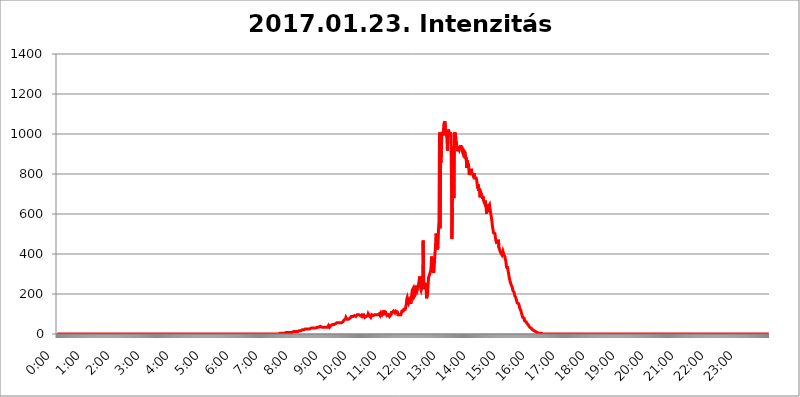
| Category | 2017.01.23. Intenzitás [W/m^2] |
|---|---|
| 0.0 | 0 |
| 0.0006944444444444445 | 0 |
| 0.001388888888888889 | 0 |
| 0.0020833333333333333 | 0 |
| 0.002777777777777778 | 0 |
| 0.003472222222222222 | 0 |
| 0.004166666666666667 | 0 |
| 0.004861111111111111 | 0 |
| 0.005555555555555556 | 0 |
| 0.0062499999999999995 | 0 |
| 0.006944444444444444 | 0 |
| 0.007638888888888889 | 0 |
| 0.008333333333333333 | 0 |
| 0.009027777777777779 | 0 |
| 0.009722222222222222 | 0 |
| 0.010416666666666666 | 0 |
| 0.011111111111111112 | 0 |
| 0.011805555555555555 | 0 |
| 0.012499999999999999 | 0 |
| 0.013194444444444444 | 0 |
| 0.013888888888888888 | 0 |
| 0.014583333333333332 | 0 |
| 0.015277777777777777 | 0 |
| 0.015972222222222224 | 0 |
| 0.016666666666666666 | 0 |
| 0.017361111111111112 | 0 |
| 0.018055555555555557 | 0 |
| 0.01875 | 0 |
| 0.019444444444444445 | 0 |
| 0.02013888888888889 | 0 |
| 0.020833333333333332 | 0 |
| 0.02152777777777778 | 0 |
| 0.022222222222222223 | 0 |
| 0.02291666666666667 | 0 |
| 0.02361111111111111 | 0 |
| 0.024305555555555556 | 0 |
| 0.024999999999999998 | 0 |
| 0.025694444444444447 | 0 |
| 0.02638888888888889 | 0 |
| 0.027083333333333334 | 0 |
| 0.027777777777777776 | 0 |
| 0.02847222222222222 | 0 |
| 0.029166666666666664 | 0 |
| 0.029861111111111113 | 0 |
| 0.030555555555555555 | 0 |
| 0.03125 | 0 |
| 0.03194444444444445 | 0 |
| 0.03263888888888889 | 0 |
| 0.03333333333333333 | 0 |
| 0.034027777777777775 | 0 |
| 0.034722222222222224 | 0 |
| 0.035416666666666666 | 0 |
| 0.036111111111111115 | 0 |
| 0.03680555555555556 | 0 |
| 0.0375 | 0 |
| 0.03819444444444444 | 0 |
| 0.03888888888888889 | 0 |
| 0.03958333333333333 | 0 |
| 0.04027777777777778 | 0 |
| 0.04097222222222222 | 0 |
| 0.041666666666666664 | 0 |
| 0.042361111111111106 | 0 |
| 0.04305555555555556 | 0 |
| 0.043750000000000004 | 0 |
| 0.044444444444444446 | 0 |
| 0.04513888888888889 | 0 |
| 0.04583333333333334 | 0 |
| 0.04652777777777778 | 0 |
| 0.04722222222222222 | 0 |
| 0.04791666666666666 | 0 |
| 0.04861111111111111 | 0 |
| 0.049305555555555554 | 0 |
| 0.049999999999999996 | 0 |
| 0.05069444444444445 | 0 |
| 0.051388888888888894 | 0 |
| 0.052083333333333336 | 0 |
| 0.05277777777777778 | 0 |
| 0.05347222222222222 | 0 |
| 0.05416666666666667 | 0 |
| 0.05486111111111111 | 0 |
| 0.05555555555555555 | 0 |
| 0.05625 | 0 |
| 0.05694444444444444 | 0 |
| 0.057638888888888885 | 0 |
| 0.05833333333333333 | 0 |
| 0.05902777777777778 | 0 |
| 0.059722222222222225 | 0 |
| 0.06041666666666667 | 0 |
| 0.061111111111111116 | 0 |
| 0.06180555555555556 | 0 |
| 0.0625 | 0 |
| 0.06319444444444444 | 0 |
| 0.06388888888888888 | 0 |
| 0.06458333333333334 | 0 |
| 0.06527777777777778 | 0 |
| 0.06597222222222222 | 0 |
| 0.06666666666666667 | 0 |
| 0.06736111111111111 | 0 |
| 0.06805555555555555 | 0 |
| 0.06874999999999999 | 0 |
| 0.06944444444444443 | 0 |
| 0.07013888888888889 | 0 |
| 0.07083333333333333 | 0 |
| 0.07152777777777779 | 0 |
| 0.07222222222222223 | 0 |
| 0.07291666666666667 | 0 |
| 0.07361111111111111 | 0 |
| 0.07430555555555556 | 0 |
| 0.075 | 0 |
| 0.07569444444444444 | 0 |
| 0.0763888888888889 | 0 |
| 0.07708333333333334 | 0 |
| 0.07777777777777778 | 0 |
| 0.07847222222222222 | 0 |
| 0.07916666666666666 | 0 |
| 0.0798611111111111 | 0 |
| 0.08055555555555556 | 0 |
| 0.08125 | 0 |
| 0.08194444444444444 | 0 |
| 0.08263888888888889 | 0 |
| 0.08333333333333333 | 0 |
| 0.08402777777777777 | 0 |
| 0.08472222222222221 | 0 |
| 0.08541666666666665 | 0 |
| 0.08611111111111112 | 0 |
| 0.08680555555555557 | 0 |
| 0.08750000000000001 | 0 |
| 0.08819444444444445 | 0 |
| 0.08888888888888889 | 0 |
| 0.08958333333333333 | 0 |
| 0.09027777777777778 | 0 |
| 0.09097222222222222 | 0 |
| 0.09166666666666667 | 0 |
| 0.09236111111111112 | 0 |
| 0.09305555555555556 | 0 |
| 0.09375 | 0 |
| 0.09444444444444444 | 0 |
| 0.09513888888888888 | 0 |
| 0.09583333333333333 | 0 |
| 0.09652777777777777 | 0 |
| 0.09722222222222222 | 0 |
| 0.09791666666666667 | 0 |
| 0.09861111111111111 | 0 |
| 0.09930555555555555 | 0 |
| 0.09999999999999999 | 0 |
| 0.10069444444444443 | 0 |
| 0.1013888888888889 | 0 |
| 0.10208333333333335 | 0 |
| 0.10277777777777779 | 0 |
| 0.10347222222222223 | 0 |
| 0.10416666666666667 | 0 |
| 0.10486111111111111 | 0 |
| 0.10555555555555556 | 0 |
| 0.10625 | 0 |
| 0.10694444444444444 | 0 |
| 0.1076388888888889 | 0 |
| 0.10833333333333334 | 0 |
| 0.10902777777777778 | 0 |
| 0.10972222222222222 | 0 |
| 0.1111111111111111 | 0 |
| 0.11180555555555556 | 0 |
| 0.11180555555555556 | 0 |
| 0.1125 | 0 |
| 0.11319444444444444 | 0 |
| 0.11388888888888889 | 0 |
| 0.11458333333333333 | 0 |
| 0.11527777777777777 | 0 |
| 0.11597222222222221 | 0 |
| 0.11666666666666665 | 0 |
| 0.1173611111111111 | 0 |
| 0.11805555555555557 | 0 |
| 0.11944444444444445 | 0 |
| 0.12013888888888889 | 0 |
| 0.12083333333333333 | 0 |
| 0.12152777777777778 | 0 |
| 0.12222222222222223 | 0 |
| 0.12291666666666667 | 0 |
| 0.12291666666666667 | 0 |
| 0.12361111111111112 | 0 |
| 0.12430555555555556 | 0 |
| 0.125 | 0 |
| 0.12569444444444444 | 0 |
| 0.12638888888888888 | 0 |
| 0.12708333333333333 | 0 |
| 0.16875 | 0 |
| 0.12847222222222224 | 0 |
| 0.12916666666666668 | 0 |
| 0.12986111111111112 | 0 |
| 0.13055555555555556 | 0 |
| 0.13125 | 0 |
| 0.13194444444444445 | 0 |
| 0.1326388888888889 | 0 |
| 0.13333333333333333 | 0 |
| 0.13402777777777777 | 0 |
| 0.13402777777777777 | 0 |
| 0.13472222222222222 | 0 |
| 0.13541666666666666 | 0 |
| 0.1361111111111111 | 0 |
| 0.13749999999999998 | 0 |
| 0.13819444444444443 | 0 |
| 0.1388888888888889 | 0 |
| 0.13958333333333334 | 0 |
| 0.14027777777777778 | 0 |
| 0.14097222222222222 | 0 |
| 0.14166666666666666 | 0 |
| 0.1423611111111111 | 0 |
| 0.14305555555555557 | 0 |
| 0.14375000000000002 | 0 |
| 0.14444444444444446 | 0 |
| 0.1451388888888889 | 0 |
| 0.1451388888888889 | 0 |
| 0.14652777777777778 | 0 |
| 0.14722222222222223 | 0 |
| 0.14791666666666667 | 0 |
| 0.1486111111111111 | 0 |
| 0.14930555555555555 | 0 |
| 0.15 | 0 |
| 0.15069444444444444 | 0 |
| 0.15138888888888888 | 0 |
| 0.15208333333333332 | 0 |
| 0.15277777777777776 | 0 |
| 0.15347222222222223 | 0 |
| 0.15416666666666667 | 0 |
| 0.15486111111111112 | 0 |
| 0.15555555555555556 | 0 |
| 0.15625 | 0 |
| 0.15694444444444444 | 0 |
| 0.15763888888888888 | 0 |
| 0.15833333333333333 | 0 |
| 0.15902777777777777 | 0 |
| 0.15972222222222224 | 0 |
| 0.16041666666666668 | 0 |
| 0.16111111111111112 | 0 |
| 0.16180555555555556 | 0 |
| 0.1625 | 0 |
| 0.16319444444444445 | 0 |
| 0.1638888888888889 | 0 |
| 0.16458333333333333 | 0 |
| 0.16527777777777777 | 0 |
| 0.16597222222222222 | 0 |
| 0.16666666666666666 | 0 |
| 0.1673611111111111 | 0 |
| 0.16805555555555554 | 0 |
| 0.16874999999999998 | 0 |
| 0.16944444444444443 | 0 |
| 0.17013888888888887 | 0 |
| 0.1708333333333333 | 0 |
| 0.17152777777777775 | 0 |
| 0.17222222222222225 | 0 |
| 0.1729166666666667 | 0 |
| 0.17361111111111113 | 0 |
| 0.17430555555555557 | 0 |
| 0.17500000000000002 | 0 |
| 0.17569444444444446 | 0 |
| 0.1763888888888889 | 0 |
| 0.17708333333333334 | 0 |
| 0.17777777777777778 | 0 |
| 0.17847222222222223 | 0 |
| 0.17916666666666667 | 0 |
| 0.1798611111111111 | 0 |
| 0.18055555555555555 | 0 |
| 0.18125 | 0 |
| 0.18194444444444444 | 0 |
| 0.1826388888888889 | 0 |
| 0.18333333333333335 | 0 |
| 0.1840277777777778 | 0 |
| 0.18472222222222223 | 0 |
| 0.18541666666666667 | 0 |
| 0.18611111111111112 | 0 |
| 0.18680555555555556 | 0 |
| 0.1875 | 0 |
| 0.18819444444444444 | 0 |
| 0.18888888888888888 | 0 |
| 0.18958333333333333 | 0 |
| 0.19027777777777777 | 0 |
| 0.1909722222222222 | 0 |
| 0.19166666666666665 | 0 |
| 0.19236111111111112 | 0 |
| 0.19305555555555554 | 0 |
| 0.19375 | 0 |
| 0.19444444444444445 | 0 |
| 0.1951388888888889 | 0 |
| 0.19583333333333333 | 0 |
| 0.19652777777777777 | 0 |
| 0.19722222222222222 | 0 |
| 0.19791666666666666 | 0 |
| 0.1986111111111111 | 0 |
| 0.19930555555555554 | 0 |
| 0.19999999999999998 | 0 |
| 0.20069444444444443 | 0 |
| 0.20138888888888887 | 0 |
| 0.2020833333333333 | 0 |
| 0.2027777777777778 | 0 |
| 0.2034722222222222 | 0 |
| 0.2041666666666667 | 0 |
| 0.20486111111111113 | 0 |
| 0.20555555555555557 | 0 |
| 0.20625000000000002 | 0 |
| 0.20694444444444446 | 0 |
| 0.2076388888888889 | 0 |
| 0.20833333333333334 | 0 |
| 0.20902777777777778 | 0 |
| 0.20972222222222223 | 0 |
| 0.21041666666666667 | 0 |
| 0.2111111111111111 | 0 |
| 0.21180555555555555 | 0 |
| 0.2125 | 0 |
| 0.21319444444444444 | 0 |
| 0.2138888888888889 | 0 |
| 0.21458333333333335 | 0 |
| 0.2152777777777778 | 0 |
| 0.21597222222222223 | 0 |
| 0.21666666666666667 | 0 |
| 0.21736111111111112 | 0 |
| 0.21805555555555556 | 0 |
| 0.21875 | 0 |
| 0.21944444444444444 | 0 |
| 0.22013888888888888 | 0 |
| 0.22083333333333333 | 0 |
| 0.22152777777777777 | 0 |
| 0.2222222222222222 | 0 |
| 0.22291666666666665 | 0 |
| 0.2236111111111111 | 0 |
| 0.22430555555555556 | 0 |
| 0.225 | 0 |
| 0.22569444444444445 | 0 |
| 0.2263888888888889 | 0 |
| 0.22708333333333333 | 0 |
| 0.22777777777777777 | 0 |
| 0.22847222222222222 | 0 |
| 0.22916666666666666 | 0 |
| 0.2298611111111111 | 0 |
| 0.23055555555555554 | 0 |
| 0.23124999999999998 | 0 |
| 0.23194444444444443 | 0 |
| 0.23263888888888887 | 0 |
| 0.2333333333333333 | 0 |
| 0.2340277777777778 | 0 |
| 0.2347222222222222 | 0 |
| 0.2354166666666667 | 0 |
| 0.23611111111111113 | 0 |
| 0.23680555555555557 | 0 |
| 0.23750000000000002 | 0 |
| 0.23819444444444446 | 0 |
| 0.2388888888888889 | 0 |
| 0.23958333333333334 | 0 |
| 0.24027777777777778 | 0 |
| 0.24097222222222223 | 0 |
| 0.24166666666666667 | 0 |
| 0.2423611111111111 | 0 |
| 0.24305555555555555 | 0 |
| 0.24375 | 0 |
| 0.24444444444444446 | 0 |
| 0.24513888888888888 | 0 |
| 0.24583333333333335 | 0 |
| 0.2465277777777778 | 0 |
| 0.24722222222222223 | 0 |
| 0.24791666666666667 | 0 |
| 0.24861111111111112 | 0 |
| 0.24930555555555556 | 0 |
| 0.25 | 0 |
| 0.25069444444444444 | 0 |
| 0.2513888888888889 | 0 |
| 0.2520833333333333 | 0 |
| 0.25277777777777777 | 0 |
| 0.2534722222222222 | 0 |
| 0.25416666666666665 | 0 |
| 0.2548611111111111 | 0 |
| 0.2555555555555556 | 0 |
| 0.25625000000000003 | 0 |
| 0.2569444444444445 | 0 |
| 0.2576388888888889 | 0 |
| 0.25833333333333336 | 0 |
| 0.2590277777777778 | 0 |
| 0.25972222222222224 | 0 |
| 0.2604166666666667 | 0 |
| 0.2611111111111111 | 0 |
| 0.26180555555555557 | 0 |
| 0.2625 | 0 |
| 0.26319444444444445 | 0 |
| 0.2638888888888889 | 0 |
| 0.26458333333333334 | 0 |
| 0.2652777777777778 | 0 |
| 0.2659722222222222 | 0 |
| 0.26666666666666666 | 0 |
| 0.2673611111111111 | 0 |
| 0.26805555555555555 | 0 |
| 0.26875 | 0 |
| 0.26944444444444443 | 0 |
| 0.2701388888888889 | 0 |
| 0.2708333333333333 | 0 |
| 0.27152777777777776 | 0 |
| 0.2722222222222222 | 0 |
| 0.27291666666666664 | 0 |
| 0.2736111111111111 | 0 |
| 0.2743055555555555 | 0 |
| 0.27499999999999997 | 0 |
| 0.27569444444444446 | 0 |
| 0.27638888888888885 | 0 |
| 0.27708333333333335 | 0 |
| 0.2777777777777778 | 0 |
| 0.27847222222222223 | 0 |
| 0.2791666666666667 | 0 |
| 0.2798611111111111 | 0 |
| 0.28055555555555556 | 0 |
| 0.28125 | 0 |
| 0.28194444444444444 | 0 |
| 0.2826388888888889 | 0 |
| 0.2833333333333333 | 0 |
| 0.28402777777777777 | 0 |
| 0.2847222222222222 | 0 |
| 0.28541666666666665 | 0 |
| 0.28611111111111115 | 0 |
| 0.28680555555555554 | 0 |
| 0.28750000000000003 | 0 |
| 0.2881944444444445 | 0 |
| 0.2888888888888889 | 0 |
| 0.28958333333333336 | 0 |
| 0.2902777777777778 | 0 |
| 0.29097222222222224 | 0 |
| 0.2916666666666667 | 0 |
| 0.2923611111111111 | 0 |
| 0.29305555555555557 | 0 |
| 0.29375 | 0 |
| 0.29444444444444445 | 0 |
| 0.2951388888888889 | 0 |
| 0.29583333333333334 | 0 |
| 0.2965277777777778 | 0 |
| 0.2972222222222222 | 0 |
| 0.29791666666666666 | 0 |
| 0.2986111111111111 | 0 |
| 0.29930555555555555 | 0 |
| 0.3 | 0 |
| 0.30069444444444443 | 0 |
| 0.3013888888888889 | 0 |
| 0.3020833333333333 | 0 |
| 0.30277777777777776 | 0 |
| 0.3034722222222222 | 0 |
| 0.30416666666666664 | 0 |
| 0.3048611111111111 | 0 |
| 0.3055555555555555 | 0 |
| 0.30624999999999997 | 0 |
| 0.3069444444444444 | 0 |
| 0.3076388888888889 | 0 |
| 0.30833333333333335 | 0 |
| 0.3090277777777778 | 0 |
| 0.30972222222222223 | 0 |
| 0.3104166666666667 | 0 |
| 0.3111111111111111 | 0 |
| 0.31180555555555556 | 0 |
| 0.3125 | 3.525 |
| 0.31319444444444444 | 3.525 |
| 0.3138888888888889 | 3.525 |
| 0.3145833333333333 | 3.525 |
| 0.31527777777777777 | 3.525 |
| 0.3159722222222222 | 3.525 |
| 0.31666666666666665 | 3.525 |
| 0.31736111111111115 | 3.525 |
| 0.31805555555555554 | 3.525 |
| 0.31875000000000003 | 3.525 |
| 0.3194444444444445 | 7.887 |
| 0.3201388888888889 | 3.525 |
| 0.32083333333333336 | 7.887 |
| 0.3215277777777778 | 7.887 |
| 0.32222222222222224 | 7.887 |
| 0.3229166666666667 | 7.887 |
| 0.3236111111111111 | 7.887 |
| 0.32430555555555557 | 7.887 |
| 0.325 | 7.887 |
| 0.32569444444444445 | 7.887 |
| 0.3263888888888889 | 7.887 |
| 0.32708333333333334 | 7.887 |
| 0.3277777777777778 | 7.887 |
| 0.3284722222222222 | 7.887 |
| 0.32916666666666666 | 7.887 |
| 0.3298611111111111 | 12.257 |
| 0.33055555555555555 | 12.257 |
| 0.33125 | 12.257 |
| 0.33194444444444443 | 12.257 |
| 0.3326388888888889 | 12.257 |
| 0.3333333333333333 | 12.257 |
| 0.3340277777777778 | 12.257 |
| 0.3347222222222222 | 12.257 |
| 0.3354166666666667 | 12.257 |
| 0.3361111111111111 | 12.257 |
| 0.3368055555555556 | 12.257 |
| 0.33749999999999997 | 12.257 |
| 0.33819444444444446 | 12.257 |
| 0.33888888888888885 | 12.257 |
| 0.33958333333333335 | 16.636 |
| 0.34027777777777773 | 16.636 |
| 0.34097222222222223 | 16.636 |
| 0.3416666666666666 | 16.636 |
| 0.3423611111111111 | 16.636 |
| 0.3430555555555555 | 16.636 |
| 0.34375 | 21.024 |
| 0.3444444444444445 | 21.024 |
| 0.3451388888888889 | 21.024 |
| 0.3458333333333334 | 21.024 |
| 0.34652777777777777 | 21.024 |
| 0.34722222222222227 | 25.419 |
| 0.34791666666666665 | 25.419 |
| 0.34861111111111115 | 25.419 |
| 0.34930555555555554 | 25.419 |
| 0.35000000000000003 | 25.419 |
| 0.3506944444444444 | 25.419 |
| 0.3513888888888889 | 25.419 |
| 0.3520833333333333 | 25.419 |
| 0.3527777777777778 | 25.419 |
| 0.3534722222222222 | 25.419 |
| 0.3541666666666667 | 25.419 |
| 0.3548611111111111 | 29.823 |
| 0.35555555555555557 | 29.823 |
| 0.35625 | 29.823 |
| 0.35694444444444445 | 29.823 |
| 0.3576388888888889 | 29.823 |
| 0.35833333333333334 | 29.823 |
| 0.3590277777777778 | 29.823 |
| 0.3597222222222222 | 29.823 |
| 0.36041666666666666 | 29.823 |
| 0.3611111111111111 | 29.823 |
| 0.36180555555555555 | 34.234 |
| 0.3625 | 29.823 |
| 0.36319444444444443 | 29.823 |
| 0.3638888888888889 | 34.234 |
| 0.3645833333333333 | 34.234 |
| 0.3652777777777778 | 34.234 |
| 0.3659722222222222 | 34.234 |
| 0.3666666666666667 | 34.234 |
| 0.3673611111111111 | 34.234 |
| 0.3680555555555556 | 34.234 |
| 0.36874999999999997 | 38.653 |
| 0.36944444444444446 | 34.234 |
| 0.37013888888888885 | 34.234 |
| 0.37083333333333335 | 34.234 |
| 0.37152777777777773 | 34.234 |
| 0.37222222222222223 | 29.823 |
| 0.3729166666666666 | 34.234 |
| 0.3736111111111111 | 34.234 |
| 0.3743055555555555 | 34.234 |
| 0.375 | 34.234 |
| 0.3756944444444445 | 34.234 |
| 0.3763888888888889 | 34.234 |
| 0.3770833333333334 | 34.234 |
| 0.37777777777777777 | 34.234 |
| 0.37847222222222227 | 34.234 |
| 0.37916666666666665 | 34.234 |
| 0.37986111111111115 | 38.653 |
| 0.38055555555555554 | 43.079 |
| 0.38125000000000003 | 38.653 |
| 0.3819444444444444 | 34.234 |
| 0.3826388888888889 | 34.234 |
| 0.3833333333333333 | 38.653 |
| 0.3840277777777778 | 43.079 |
| 0.3847222222222222 | 43.079 |
| 0.3854166666666667 | 47.511 |
| 0.3861111111111111 | 47.511 |
| 0.38680555555555557 | 43.079 |
| 0.3875 | 47.511 |
| 0.38819444444444445 | 47.511 |
| 0.3888888888888889 | 47.511 |
| 0.38958333333333334 | 51.951 |
| 0.3902777777777778 | 51.951 |
| 0.3909722222222222 | 51.951 |
| 0.39166666666666666 | 51.951 |
| 0.3923611111111111 | 56.398 |
| 0.39305555555555555 | 56.398 |
| 0.39375 | 56.398 |
| 0.39444444444444443 | 56.398 |
| 0.3951388888888889 | 56.398 |
| 0.3958333333333333 | 56.398 |
| 0.3965277777777778 | 56.398 |
| 0.3972222222222222 | 56.398 |
| 0.3979166666666667 | 56.398 |
| 0.3986111111111111 | 56.398 |
| 0.3993055555555556 | 60.85 |
| 0.39999999999999997 | 60.85 |
| 0.40069444444444446 | 60.85 |
| 0.40138888888888885 | 65.31 |
| 0.40208333333333335 | 69.775 |
| 0.40277777777777773 | 69.775 |
| 0.40347222222222223 | 65.31 |
| 0.4041666666666666 | 74.246 |
| 0.4048611111111111 | 83.205 |
| 0.4055555555555555 | 78.722 |
| 0.40625 | 74.246 |
| 0.4069444444444445 | 74.246 |
| 0.4076388888888889 | 69.775 |
| 0.4083333333333334 | 74.246 |
| 0.40902777777777777 | 69.775 |
| 0.40972222222222227 | 74.246 |
| 0.41041666666666665 | 78.722 |
| 0.41111111111111115 | 83.205 |
| 0.41180555555555554 | 83.205 |
| 0.41250000000000003 | 87.692 |
| 0.4131944444444444 | 83.205 |
| 0.4138888888888889 | 83.205 |
| 0.4145833333333333 | 87.692 |
| 0.4152777777777778 | 83.205 |
| 0.4159722222222222 | 87.692 |
| 0.4166666666666667 | 92.184 |
| 0.4173611111111111 | 92.184 |
| 0.41805555555555557 | 87.692 |
| 0.41875 | 87.692 |
| 0.41944444444444445 | 87.692 |
| 0.4201388888888889 | 92.184 |
| 0.42083333333333334 | 96.682 |
| 0.4215277777777778 | 96.682 |
| 0.4222222222222222 | 101.184 |
| 0.42291666666666666 | 96.682 |
| 0.4236111111111111 | 92.184 |
| 0.42430555555555555 | 92.184 |
| 0.425 | 92.184 |
| 0.42569444444444443 | 92.184 |
| 0.4263888888888889 | 92.184 |
| 0.4270833333333333 | 87.692 |
| 0.4277777777777778 | 96.682 |
| 0.4284722222222222 | 92.184 |
| 0.4291666666666667 | 92.184 |
| 0.4298611111111111 | 96.682 |
| 0.4305555555555556 | 92.184 |
| 0.43124999999999997 | 83.205 |
| 0.43194444444444446 | 87.692 |
| 0.43263888888888885 | 87.692 |
| 0.43333333333333335 | 87.692 |
| 0.43402777777777773 | 87.692 |
| 0.43472222222222223 | 87.692 |
| 0.4354166666666666 | 92.184 |
| 0.4361111111111111 | 101.184 |
| 0.4368055555555555 | 101.184 |
| 0.4375 | 92.184 |
| 0.4381944444444445 | 92.184 |
| 0.4388888888888889 | 92.184 |
| 0.4395833333333334 | 83.205 |
| 0.44027777777777777 | 87.692 |
| 0.44097222222222227 | 96.682 |
| 0.44166666666666665 | 101.184 |
| 0.44236111111111115 | 96.682 |
| 0.44305555555555554 | 92.184 |
| 0.44375000000000003 | 87.692 |
| 0.4444444444444444 | 92.184 |
| 0.4451388888888889 | 96.682 |
| 0.4458333333333333 | 101.184 |
| 0.4465277777777778 | 96.682 |
| 0.4472222222222222 | 96.682 |
| 0.4479166666666667 | 96.682 |
| 0.4486111111111111 | 96.682 |
| 0.44930555555555557 | 96.682 |
| 0.45 | 101.184 |
| 0.45069444444444445 | 101.184 |
| 0.4513888888888889 | 101.184 |
| 0.45208333333333334 | 96.682 |
| 0.4527777777777778 | 92.184 |
| 0.4534722222222222 | 96.682 |
| 0.45416666666666666 | 105.69 |
| 0.4548611111111111 | 101.184 |
| 0.45555555555555555 | 96.682 |
| 0.45625 | 96.682 |
| 0.45694444444444443 | 101.184 |
| 0.4576388888888889 | 110.201 |
| 0.4583333333333333 | 119.235 |
| 0.4590277777777778 | 101.184 |
| 0.4597222222222222 | 101.184 |
| 0.4604166666666667 | 105.69 |
| 0.4611111111111111 | 105.69 |
| 0.4618055555555556 | 101.184 |
| 0.46249999999999997 | 92.184 |
| 0.46319444444444446 | 92.184 |
| 0.46388888888888885 | 87.692 |
| 0.46458333333333335 | 96.682 |
| 0.46527777777777773 | 101.184 |
| 0.46597222222222223 | 87.692 |
| 0.4666666666666666 | 87.692 |
| 0.4673611111111111 | 92.184 |
| 0.4680555555555555 | 96.682 |
| 0.46875 | 114.716 |
| 0.4694444444444445 | 105.69 |
| 0.4701388888888889 | 101.184 |
| 0.4708333333333334 | 110.201 |
| 0.47152777777777777 | 114.716 |
| 0.47222222222222227 | 114.716 |
| 0.47291666666666665 | 114.716 |
| 0.47361111111111115 | 105.69 |
| 0.47430555555555554 | 110.201 |
| 0.47500000000000003 | 114.716 |
| 0.4756944444444444 | 114.716 |
| 0.4763888888888889 | 119.235 |
| 0.4770833333333333 | 110.201 |
| 0.4777777777777778 | 96.682 |
| 0.4784722222222222 | 92.184 |
| 0.4791666666666667 | 101.184 |
| 0.4798611111111111 | 96.682 |
| 0.48055555555555557 | 96.682 |
| 0.48125 | 96.682 |
| 0.48194444444444445 | 96.682 |
| 0.4826388888888889 | 101.184 |
| 0.48333333333333334 | 114.716 |
| 0.4840277777777778 | 119.235 |
| 0.4847222222222222 | 119.235 |
| 0.48541666666666666 | 114.716 |
| 0.4861111111111111 | 123.758 |
| 0.48680555555555555 | 128.284 |
| 0.4875 | 128.284 |
| 0.48819444444444443 | 123.758 |
| 0.4888888888888889 | 137.347 |
| 0.4895833333333333 | 150.964 |
| 0.4902777777777778 | 173.709 |
| 0.4909722222222222 | 182.82 |
| 0.4916666666666667 | 173.709 |
| 0.4923611111111111 | 164.605 |
| 0.4930555555555556 | 155.509 |
| 0.49374999999999997 | 155.509 |
| 0.49444444444444446 | 169.156 |
| 0.49513888888888885 | 169.156 |
| 0.49583333333333335 | 150.964 |
| 0.49652777777777773 | 155.509 |
| 0.49722222222222223 | 191.937 |
| 0.4979166666666666 | 219.309 |
| 0.4986111111111111 | 223.873 |
| 0.4993055555555555 | 228.436 |
| 0.5 | 205.62 |
| 0.5006944444444444 | 187.378 |
| 0.5013888888888889 | 182.82 |
| 0.5020833333333333 | 196.497 |
| 0.5027777777777778 | 233 |
| 0.5034722222222222 | 242.127 |
| 0.5041666666666667 | 228.436 |
| 0.5048611111111111 | 219.309 |
| 0.5055555555555555 | 228.436 |
| 0.50625 | 237.564 |
| 0.5069444444444444 | 251.251 |
| 0.5076388888888889 | 269.49 |
| 0.5083333333333333 | 287.709 |
| 0.5090277777777777 | 255.813 |
| 0.5097222222222222 | 228.436 |
| 0.5104166666666666 | 219.309 |
| 0.5111111111111112 | 228.436 |
| 0.5118055555555555 | 228.436 |
| 0.5125000000000001 | 251.251 |
| 0.5131944444444444 | 467.187 |
| 0.513888888888889 | 269.49 |
| 0.5145833333333333 | 223.873 |
| 0.5152777777777778 | 237.564 |
| 0.5159722222222222 | 255.813 |
| 0.5166666666666667 | 237.564 |
| 0.517361111111111 | 228.436 |
| 0.5180555555555556 | 178.264 |
| 0.5187499999999999 | 178.264 |
| 0.5194444444444445 | 205.62 |
| 0.5201388888888888 | 246.689 |
| 0.5208333333333334 | 283.156 |
| 0.5215277777777778 | 287.709 |
| 0.5222222222222223 | 287.709 |
| 0.5229166666666667 | 305.898 |
| 0.5236111111111111 | 314.98 |
| 0.5243055555555556 | 333.113 |
| 0.525 | 387.202 |
| 0.5256944444444445 | 369.23 |
| 0.5263888888888889 | 324.052 |
| 0.5270833333333333 | 314.98 |
| 0.5277777777777778 | 305.898 |
| 0.5284722222222222 | 319.517 |
| 0.5291666666666667 | 369.23 |
| 0.5298611111111111 | 405.108 |
| 0.5305555555555556 | 440.702 |
| 0.53125 | 502.192 |
| 0.5319444444444444 | 489.108 |
| 0.5326388888888889 | 431.833 |
| 0.5333333333333333 | 422.943 |
| 0.5340277777777778 | 436.27 |
| 0.5347222222222222 | 523.88 |
| 0.5354166666666667 | 562.53 |
| 0.5361111111111111 | 1007.383 |
| 0.5368055555555555 | 528.2 |
| 0.5375 | 875.918 |
| 0.5381944444444444 | 856.855 |
| 0.5388888888888889 | 940.082 |
| 0.5395833333333333 | 1011.118 |
| 0.5402777777777777 | 1014.852 |
| 0.5409722222222222 | 992.448 |
| 0.5416666666666666 | 1014.852 |
| 0.5423611111111112 | 1052.255 |
| 0.5430555555555555 | 1052.255 |
| 0.5437500000000001 | 1063.51 |
| 0.5444444444444444 | 1022.323 |
| 0.545138888888889 | 1011.118 |
| 0.5458333333333333 | 1011.118 |
| 0.5465277777777778 | 977.508 |
| 0.5472222222222222 | 917.534 |
| 0.5479166666666667 | 996.182 |
| 0.548611111111111 | 1022.323 |
| 0.5493055555555556 | 1011.118 |
| 0.5499999999999999 | 1011.118 |
| 0.5506944444444445 | 984.98 |
| 0.5513888888888888 | 1007.383 |
| 0.5520833333333334 | 992.448 |
| 0.5527777777777778 | 833.834 |
| 0.5534722222222223 | 475.972 |
| 0.5541666666666667 | 629.948 |
| 0.5548611111111111 | 891.099 |
| 0.5555555555555556 | 936.33 |
| 0.55625 | 679.395 |
| 0.5569444444444445 | 1007.383 |
| 0.5576388888888889 | 999.916 |
| 0.5583333333333333 | 1007.383 |
| 0.5590277777777778 | 973.772 |
| 0.5597222222222222 | 962.555 |
| 0.5604166666666667 | 940.082 |
| 0.5611111111111111 | 932.576 |
| 0.5618055555555556 | 913.766 |
| 0.5625 | 936.33 |
| 0.5631944444444444 | 928.819 |
| 0.5638888888888889 | 921.298 |
| 0.5645833333333333 | 921.298 |
| 0.5652777777777778 | 917.534 |
| 0.5659722222222222 | 943.832 |
| 0.5666666666666667 | 925.06 |
| 0.5673611111111111 | 936.33 |
| 0.5680555555555555 | 913.766 |
| 0.56875 | 909.996 |
| 0.5694444444444444 | 898.668 |
| 0.5701388888888889 | 902.447 |
| 0.5708333333333333 | 913.766 |
| 0.5715277777777777 | 917.534 |
| 0.5722222222222222 | 906.223 |
| 0.5729166666666666 | 875.918 |
| 0.5736111111111112 | 883.516 |
| 0.5743055555555555 | 829.981 |
| 0.5750000000000001 | 868.305 |
| 0.5756944444444444 | 845.365 |
| 0.576388888888889 | 853.029 |
| 0.5770833333333333 | 837.682 |
| 0.5777777777777778 | 795.074 |
| 0.5784722222222222 | 802.868 |
| 0.5791666666666667 | 802.868 |
| 0.579861111111111 | 810.641 |
| 0.5805555555555556 | 826.123 |
| 0.5812499999999999 | 810.641 |
| 0.5819444444444445 | 814.519 |
| 0.5826388888888888 | 814.519 |
| 0.5833333333333334 | 791.169 |
| 0.5840277777777778 | 795.074 |
| 0.5847222222222223 | 802.868 |
| 0.5854166666666667 | 779.42 |
| 0.5861111111111111 | 779.42 |
| 0.5868055555555556 | 783.342 |
| 0.5875 | 779.42 |
| 0.5881944444444445 | 771.559 |
| 0.5888888888888889 | 751.803 |
| 0.5895833333333333 | 727.896 |
| 0.5902777777777778 | 747.834 |
| 0.5909722222222222 | 715.858 |
| 0.5916666666666667 | 711.832 |
| 0.5923611111111111 | 727.896 |
| 0.5930555555555556 | 683.473 |
| 0.59375 | 695.666 |
| 0.5944444444444444 | 703.762 |
| 0.5951388888888889 | 699.717 |
| 0.5958333333333333 | 691.608 |
| 0.5965277777777778 | 675.311 |
| 0.5972222222222222 | 687.544 |
| 0.5979166666666667 | 667.123 |
| 0.5986111111111111 | 667.123 |
| 0.5993055555555555 | 654.791 |
| 0.6 | 667.123 |
| 0.6006944444444444 | 658.909 |
| 0.6013888888888889 | 642.4 |
| 0.6020833333333333 | 600.661 |
| 0.6027777777777777 | 646.537 |
| 0.6034722222222222 | 625.784 |
| 0.6041666666666666 | 609.062 |
| 0.6048611111111112 | 638.256 |
| 0.6055555555555555 | 638.256 |
| 0.6062500000000001 | 646.537 |
| 0.6069444444444444 | 625.784 |
| 0.607638888888889 | 609.062 |
| 0.6083333333333333 | 604.864 |
| 0.6090277777777778 | 579.542 |
| 0.6097222222222222 | 562.53 |
| 0.6104166666666667 | 536.82 |
| 0.611111111111111 | 523.88 |
| 0.6118055555555556 | 506.542 |
| 0.6124999999999999 | 502.192 |
| 0.6131944444444445 | 502.192 |
| 0.6138888888888888 | 502.192 |
| 0.6145833333333334 | 480.356 |
| 0.6152777777777778 | 467.187 |
| 0.6159722222222223 | 458.38 |
| 0.6166666666666667 | 462.786 |
| 0.6173611111111111 | 458.38 |
| 0.6180555555555556 | 462.786 |
| 0.61875 | 471.582 |
| 0.6194444444444445 | 431.833 |
| 0.6201388888888889 | 436.27 |
| 0.6208333333333333 | 427.39 |
| 0.6215277777777778 | 409.574 |
| 0.6222222222222222 | 405.108 |
| 0.6229166666666667 | 400.638 |
| 0.6236111111111111 | 414.035 |
| 0.6243055555555556 | 405.108 |
| 0.625 | 414.035 |
| 0.6256944444444444 | 405.108 |
| 0.6263888888888889 | 396.164 |
| 0.6270833333333333 | 391.685 |
| 0.6277777777777778 | 387.202 |
| 0.6284722222222222 | 373.729 |
| 0.6291666666666667 | 364.728 |
| 0.6298611111111111 | 342.162 |
| 0.6305555555555555 | 328.584 |
| 0.63125 | 337.639 |
| 0.6319444444444444 | 324.052 |
| 0.6326388888888889 | 310.44 |
| 0.6333333333333333 | 296.808 |
| 0.6340277777777777 | 278.603 |
| 0.6347222222222222 | 269.49 |
| 0.6354166666666666 | 260.373 |
| 0.6361111111111112 | 251.251 |
| 0.6368055555555555 | 251.251 |
| 0.6375000000000001 | 246.689 |
| 0.6381944444444444 | 233 |
| 0.638888888888889 | 219.309 |
| 0.6395833333333333 | 223.873 |
| 0.6402777777777778 | 214.746 |
| 0.6409722222222222 | 205.62 |
| 0.6416666666666667 | 191.937 |
| 0.642361111111111 | 191.937 |
| 0.6430555555555556 | 182.82 |
| 0.6437499999999999 | 173.709 |
| 0.6444444444444445 | 169.156 |
| 0.6451388888888888 | 155.509 |
| 0.6458333333333334 | 155.509 |
| 0.6465277777777778 | 150.964 |
| 0.6472222222222223 | 150.964 |
| 0.6479166666666667 | 141.884 |
| 0.6486111111111111 | 128.284 |
| 0.6493055555555556 | 123.758 |
| 0.65 | 119.235 |
| 0.6506944444444445 | 110.201 |
| 0.6513888888888889 | 101.184 |
| 0.6520833333333333 | 96.682 |
| 0.6527777777777778 | 83.205 |
| 0.6534722222222222 | 83.205 |
| 0.6541666666666667 | 83.205 |
| 0.6548611111111111 | 78.722 |
| 0.6555555555555556 | 65.31 |
| 0.65625 | 65.31 |
| 0.6569444444444444 | 65.31 |
| 0.6576388888888889 | 60.85 |
| 0.6583333333333333 | 56.398 |
| 0.6590277777777778 | 51.951 |
| 0.6597222222222222 | 47.511 |
| 0.6604166666666667 | 47.511 |
| 0.6611111111111111 | 43.079 |
| 0.6618055555555555 | 38.653 |
| 0.6625 | 34.234 |
| 0.6631944444444444 | 29.823 |
| 0.6638888888888889 | 29.823 |
| 0.6645833333333333 | 29.823 |
| 0.6652777777777777 | 25.419 |
| 0.6659722222222222 | 25.419 |
| 0.6666666666666666 | 21.024 |
| 0.6673611111111111 | 21.024 |
| 0.6680555555555556 | 21.024 |
| 0.6687500000000001 | 16.636 |
| 0.6694444444444444 | 16.636 |
| 0.6701388888888888 | 12.257 |
| 0.6708333333333334 | 12.257 |
| 0.6715277777777778 | 12.257 |
| 0.6722222222222222 | 12.257 |
| 0.6729166666666666 | 7.887 |
| 0.6736111111111112 | 7.887 |
| 0.6743055555555556 | 7.887 |
| 0.6749999999999999 | 3.525 |
| 0.6756944444444444 | 3.525 |
| 0.6763888888888889 | 3.525 |
| 0.6770833333333334 | 3.525 |
| 0.6777777777777777 | 3.525 |
| 0.6784722222222223 | 3.525 |
| 0.6791666666666667 | 3.525 |
| 0.6798611111111111 | 3.525 |
| 0.6805555555555555 | 3.525 |
| 0.68125 | 0 |
| 0.6819444444444445 | 0 |
| 0.6826388888888889 | 0 |
| 0.6833333333333332 | 0 |
| 0.6840277777777778 | 0 |
| 0.6847222222222222 | 0 |
| 0.6854166666666667 | 0 |
| 0.686111111111111 | 0 |
| 0.6868055555555556 | 0 |
| 0.6875 | 0 |
| 0.6881944444444444 | 0 |
| 0.688888888888889 | 0 |
| 0.6895833333333333 | 0 |
| 0.6902777777777778 | 0 |
| 0.6909722222222222 | 0 |
| 0.6916666666666668 | 0 |
| 0.6923611111111111 | 0 |
| 0.6930555555555555 | 0 |
| 0.69375 | 0 |
| 0.6944444444444445 | 0 |
| 0.6951388888888889 | 0 |
| 0.6958333333333333 | 0 |
| 0.6965277777777777 | 0 |
| 0.6972222222222223 | 0 |
| 0.6979166666666666 | 0 |
| 0.6986111111111111 | 0 |
| 0.6993055555555556 | 0 |
| 0.7000000000000001 | 0 |
| 0.7006944444444444 | 0 |
| 0.7013888888888888 | 0 |
| 0.7020833333333334 | 0 |
| 0.7027777777777778 | 0 |
| 0.7034722222222222 | 0 |
| 0.7041666666666666 | 0 |
| 0.7048611111111112 | 0 |
| 0.7055555555555556 | 0 |
| 0.7062499999999999 | 0 |
| 0.7069444444444444 | 0 |
| 0.7076388888888889 | 0 |
| 0.7083333333333334 | 0 |
| 0.7090277777777777 | 0 |
| 0.7097222222222223 | 0 |
| 0.7104166666666667 | 0 |
| 0.7111111111111111 | 0 |
| 0.7118055555555555 | 0 |
| 0.7125 | 0 |
| 0.7131944444444445 | 0 |
| 0.7138888888888889 | 0 |
| 0.7145833333333332 | 0 |
| 0.7152777777777778 | 0 |
| 0.7159722222222222 | 0 |
| 0.7166666666666667 | 0 |
| 0.717361111111111 | 0 |
| 0.7180555555555556 | 0 |
| 0.71875 | 0 |
| 0.7194444444444444 | 0 |
| 0.720138888888889 | 0 |
| 0.7208333333333333 | 0 |
| 0.7215277777777778 | 0 |
| 0.7222222222222222 | 0 |
| 0.7229166666666668 | 0 |
| 0.7236111111111111 | 0 |
| 0.7243055555555555 | 0 |
| 0.725 | 0 |
| 0.7256944444444445 | 0 |
| 0.7263888888888889 | 0 |
| 0.7270833333333333 | 0 |
| 0.7277777777777777 | 0 |
| 0.7284722222222223 | 0 |
| 0.7291666666666666 | 0 |
| 0.7298611111111111 | 0 |
| 0.7305555555555556 | 0 |
| 0.7312500000000001 | 0 |
| 0.7319444444444444 | 0 |
| 0.7326388888888888 | 0 |
| 0.7333333333333334 | 0 |
| 0.7340277777777778 | 0 |
| 0.7347222222222222 | 0 |
| 0.7354166666666666 | 0 |
| 0.7361111111111112 | 0 |
| 0.7368055555555556 | 0 |
| 0.7374999999999999 | 0 |
| 0.7381944444444444 | 0 |
| 0.7388888888888889 | 0 |
| 0.7395833333333334 | 0 |
| 0.7402777777777777 | 0 |
| 0.7409722222222223 | 0 |
| 0.7416666666666667 | 0 |
| 0.7423611111111111 | 0 |
| 0.7430555555555555 | 0 |
| 0.74375 | 0 |
| 0.7444444444444445 | 0 |
| 0.7451388888888889 | 0 |
| 0.7458333333333332 | 0 |
| 0.7465277777777778 | 0 |
| 0.7472222222222222 | 0 |
| 0.7479166666666667 | 0 |
| 0.748611111111111 | 0 |
| 0.7493055555555556 | 0 |
| 0.75 | 0 |
| 0.7506944444444444 | 0 |
| 0.751388888888889 | 0 |
| 0.7520833333333333 | 0 |
| 0.7527777777777778 | 0 |
| 0.7534722222222222 | 0 |
| 0.7541666666666668 | 0 |
| 0.7548611111111111 | 0 |
| 0.7555555555555555 | 0 |
| 0.75625 | 0 |
| 0.7569444444444445 | 0 |
| 0.7576388888888889 | 0 |
| 0.7583333333333333 | 0 |
| 0.7590277777777777 | 0 |
| 0.7597222222222223 | 0 |
| 0.7604166666666666 | 0 |
| 0.7611111111111111 | 0 |
| 0.7618055555555556 | 0 |
| 0.7625000000000001 | 0 |
| 0.7631944444444444 | 0 |
| 0.7638888888888888 | 0 |
| 0.7645833333333334 | 0 |
| 0.7652777777777778 | 0 |
| 0.7659722222222222 | 0 |
| 0.7666666666666666 | 0 |
| 0.7673611111111112 | 0 |
| 0.7680555555555556 | 0 |
| 0.7687499999999999 | 0 |
| 0.7694444444444444 | 0 |
| 0.7701388888888889 | 0 |
| 0.7708333333333334 | 0 |
| 0.7715277777777777 | 0 |
| 0.7722222222222223 | 0 |
| 0.7729166666666667 | 0 |
| 0.7736111111111111 | 0 |
| 0.7743055555555555 | 0 |
| 0.775 | 0 |
| 0.7756944444444445 | 0 |
| 0.7763888888888889 | 0 |
| 0.7770833333333332 | 0 |
| 0.7777777777777778 | 0 |
| 0.7784722222222222 | 0 |
| 0.7791666666666667 | 0 |
| 0.779861111111111 | 0 |
| 0.7805555555555556 | 0 |
| 0.78125 | 0 |
| 0.7819444444444444 | 0 |
| 0.782638888888889 | 0 |
| 0.7833333333333333 | 0 |
| 0.7840277777777778 | 0 |
| 0.7847222222222222 | 0 |
| 0.7854166666666668 | 0 |
| 0.7861111111111111 | 0 |
| 0.7868055555555555 | 0 |
| 0.7875 | 0 |
| 0.7881944444444445 | 0 |
| 0.7888888888888889 | 0 |
| 0.7895833333333333 | 0 |
| 0.7902777777777777 | 0 |
| 0.7909722222222223 | 0 |
| 0.7916666666666666 | 0 |
| 0.7923611111111111 | 0 |
| 0.7930555555555556 | 0 |
| 0.7937500000000001 | 0 |
| 0.7944444444444444 | 0 |
| 0.7951388888888888 | 0 |
| 0.7958333333333334 | 0 |
| 0.7965277777777778 | 0 |
| 0.7972222222222222 | 0 |
| 0.7979166666666666 | 0 |
| 0.7986111111111112 | 0 |
| 0.7993055555555556 | 0 |
| 0.7999999999999999 | 0 |
| 0.8006944444444444 | 0 |
| 0.8013888888888889 | 0 |
| 0.8020833333333334 | 0 |
| 0.8027777777777777 | 0 |
| 0.8034722222222223 | 0 |
| 0.8041666666666667 | 0 |
| 0.8048611111111111 | 0 |
| 0.8055555555555555 | 0 |
| 0.80625 | 0 |
| 0.8069444444444445 | 0 |
| 0.8076388888888889 | 0 |
| 0.8083333333333332 | 0 |
| 0.8090277777777778 | 0 |
| 0.8097222222222222 | 0 |
| 0.8104166666666667 | 0 |
| 0.811111111111111 | 0 |
| 0.8118055555555556 | 0 |
| 0.8125 | 0 |
| 0.8131944444444444 | 0 |
| 0.813888888888889 | 0 |
| 0.8145833333333333 | 0 |
| 0.8152777777777778 | 0 |
| 0.8159722222222222 | 0 |
| 0.8166666666666668 | 0 |
| 0.8173611111111111 | 0 |
| 0.8180555555555555 | 0 |
| 0.81875 | 0 |
| 0.8194444444444445 | 0 |
| 0.8201388888888889 | 0 |
| 0.8208333333333333 | 0 |
| 0.8215277777777777 | 0 |
| 0.8222222222222223 | 0 |
| 0.8229166666666666 | 0 |
| 0.8236111111111111 | 0 |
| 0.8243055555555556 | 0 |
| 0.8250000000000001 | 0 |
| 0.8256944444444444 | 0 |
| 0.8263888888888888 | 0 |
| 0.8270833333333334 | 0 |
| 0.8277777777777778 | 0 |
| 0.8284722222222222 | 0 |
| 0.8291666666666666 | 0 |
| 0.8298611111111112 | 0 |
| 0.8305555555555556 | 0 |
| 0.8312499999999999 | 0 |
| 0.8319444444444444 | 0 |
| 0.8326388888888889 | 0 |
| 0.8333333333333334 | 0 |
| 0.8340277777777777 | 0 |
| 0.8347222222222223 | 0 |
| 0.8354166666666667 | 0 |
| 0.8361111111111111 | 0 |
| 0.8368055555555555 | 0 |
| 0.8375 | 0 |
| 0.8381944444444445 | 0 |
| 0.8388888888888889 | 0 |
| 0.8395833333333332 | 0 |
| 0.8402777777777778 | 0 |
| 0.8409722222222222 | 0 |
| 0.8416666666666667 | 0 |
| 0.842361111111111 | 0 |
| 0.8430555555555556 | 0 |
| 0.84375 | 0 |
| 0.8444444444444444 | 0 |
| 0.845138888888889 | 0 |
| 0.8458333333333333 | 0 |
| 0.8465277777777778 | 0 |
| 0.8472222222222222 | 0 |
| 0.8479166666666668 | 0 |
| 0.8486111111111111 | 0 |
| 0.8493055555555555 | 0 |
| 0.85 | 0 |
| 0.8506944444444445 | 0 |
| 0.8513888888888889 | 0 |
| 0.8520833333333333 | 0 |
| 0.8527777777777777 | 0 |
| 0.8534722222222223 | 0 |
| 0.8541666666666666 | 0 |
| 0.8548611111111111 | 0 |
| 0.8555555555555556 | 0 |
| 0.8562500000000001 | 0 |
| 0.8569444444444444 | 0 |
| 0.8576388888888888 | 0 |
| 0.8583333333333334 | 0 |
| 0.8590277777777778 | 0 |
| 0.8597222222222222 | 0 |
| 0.8604166666666666 | 0 |
| 0.8611111111111112 | 0 |
| 0.8618055555555556 | 0 |
| 0.8624999999999999 | 0 |
| 0.8631944444444444 | 0 |
| 0.8638888888888889 | 0 |
| 0.8645833333333334 | 0 |
| 0.8652777777777777 | 0 |
| 0.8659722222222223 | 0 |
| 0.8666666666666667 | 0 |
| 0.8673611111111111 | 0 |
| 0.8680555555555555 | 0 |
| 0.86875 | 0 |
| 0.8694444444444445 | 0 |
| 0.8701388888888889 | 0 |
| 0.8708333333333332 | 0 |
| 0.8715277777777778 | 0 |
| 0.8722222222222222 | 0 |
| 0.8729166666666667 | 0 |
| 0.873611111111111 | 0 |
| 0.8743055555555556 | 0 |
| 0.875 | 0 |
| 0.8756944444444444 | 0 |
| 0.876388888888889 | 0 |
| 0.8770833333333333 | 0 |
| 0.8777777777777778 | 0 |
| 0.8784722222222222 | 0 |
| 0.8791666666666668 | 0 |
| 0.8798611111111111 | 0 |
| 0.8805555555555555 | 0 |
| 0.88125 | 0 |
| 0.8819444444444445 | 0 |
| 0.8826388888888889 | 0 |
| 0.8833333333333333 | 0 |
| 0.8840277777777777 | 0 |
| 0.8847222222222223 | 0 |
| 0.8854166666666666 | 0 |
| 0.8861111111111111 | 0 |
| 0.8868055555555556 | 0 |
| 0.8875000000000001 | 0 |
| 0.8881944444444444 | 0 |
| 0.8888888888888888 | 0 |
| 0.8895833333333334 | 0 |
| 0.8902777777777778 | 0 |
| 0.8909722222222222 | 0 |
| 0.8916666666666666 | 0 |
| 0.8923611111111112 | 0 |
| 0.8930555555555556 | 0 |
| 0.8937499999999999 | 0 |
| 0.8944444444444444 | 0 |
| 0.8951388888888889 | 0 |
| 0.8958333333333334 | 0 |
| 0.8965277777777777 | 0 |
| 0.8972222222222223 | 0 |
| 0.8979166666666667 | 0 |
| 0.8986111111111111 | 0 |
| 0.8993055555555555 | 0 |
| 0.9 | 0 |
| 0.9006944444444445 | 0 |
| 0.9013888888888889 | 0 |
| 0.9020833333333332 | 0 |
| 0.9027777777777778 | 0 |
| 0.9034722222222222 | 0 |
| 0.9041666666666667 | 0 |
| 0.904861111111111 | 0 |
| 0.9055555555555556 | 0 |
| 0.90625 | 0 |
| 0.9069444444444444 | 0 |
| 0.907638888888889 | 0 |
| 0.9083333333333333 | 0 |
| 0.9090277777777778 | 0 |
| 0.9097222222222222 | 0 |
| 0.9104166666666668 | 0 |
| 0.9111111111111111 | 0 |
| 0.9118055555555555 | 0 |
| 0.9125 | 0 |
| 0.9131944444444445 | 0 |
| 0.9138888888888889 | 0 |
| 0.9145833333333333 | 0 |
| 0.9152777777777777 | 0 |
| 0.9159722222222223 | 0 |
| 0.9166666666666666 | 0 |
| 0.9173611111111111 | 0 |
| 0.9180555555555556 | 0 |
| 0.9187500000000001 | 0 |
| 0.9194444444444444 | 0 |
| 0.9201388888888888 | 0 |
| 0.9208333333333334 | 0 |
| 0.9215277777777778 | 0 |
| 0.9222222222222222 | 0 |
| 0.9229166666666666 | 0 |
| 0.9236111111111112 | 0 |
| 0.9243055555555556 | 0 |
| 0.9249999999999999 | 0 |
| 0.9256944444444444 | 0 |
| 0.9263888888888889 | 0 |
| 0.9270833333333334 | 0 |
| 0.9277777777777777 | 0 |
| 0.9284722222222223 | 0 |
| 0.9291666666666667 | 0 |
| 0.9298611111111111 | 0 |
| 0.9305555555555555 | 0 |
| 0.93125 | 0 |
| 0.9319444444444445 | 0 |
| 0.9326388888888889 | 0 |
| 0.9333333333333332 | 0 |
| 0.9340277777777778 | 0 |
| 0.9347222222222222 | 0 |
| 0.9354166666666667 | 0 |
| 0.936111111111111 | 0 |
| 0.9368055555555556 | 0 |
| 0.9375 | 0 |
| 0.9381944444444444 | 0 |
| 0.938888888888889 | 0 |
| 0.9395833333333333 | 0 |
| 0.9402777777777778 | 0 |
| 0.9409722222222222 | 0 |
| 0.9416666666666668 | 0 |
| 0.9423611111111111 | 0 |
| 0.9430555555555555 | 0 |
| 0.94375 | 0 |
| 0.9444444444444445 | 0 |
| 0.9451388888888889 | 0 |
| 0.9458333333333333 | 0 |
| 0.9465277777777777 | 0 |
| 0.9472222222222223 | 0 |
| 0.9479166666666666 | 0 |
| 0.9486111111111111 | 0 |
| 0.9493055555555556 | 0 |
| 0.9500000000000001 | 0 |
| 0.9506944444444444 | 0 |
| 0.9513888888888888 | 0 |
| 0.9520833333333334 | 0 |
| 0.9527777777777778 | 0 |
| 0.9534722222222222 | 0 |
| 0.9541666666666666 | 0 |
| 0.9548611111111112 | 0 |
| 0.9555555555555556 | 0 |
| 0.9562499999999999 | 0 |
| 0.9569444444444444 | 0 |
| 0.9576388888888889 | 0 |
| 0.9583333333333334 | 0 |
| 0.9590277777777777 | 0 |
| 0.9597222222222223 | 0 |
| 0.9604166666666667 | 0 |
| 0.9611111111111111 | 0 |
| 0.9618055555555555 | 0 |
| 0.9625 | 0 |
| 0.9631944444444445 | 0 |
| 0.9638888888888889 | 0 |
| 0.9645833333333332 | 0 |
| 0.9652777777777778 | 0 |
| 0.9659722222222222 | 0 |
| 0.9666666666666667 | 0 |
| 0.967361111111111 | 0 |
| 0.9680555555555556 | 0 |
| 0.96875 | 0 |
| 0.9694444444444444 | 0 |
| 0.970138888888889 | 0 |
| 0.9708333333333333 | 0 |
| 0.9715277777777778 | 0 |
| 0.9722222222222222 | 0 |
| 0.9729166666666668 | 0 |
| 0.9736111111111111 | 0 |
| 0.9743055555555555 | 0 |
| 0.975 | 0 |
| 0.9756944444444445 | 0 |
| 0.9763888888888889 | 0 |
| 0.9770833333333333 | 0 |
| 0.9777777777777777 | 0 |
| 0.9784722222222223 | 0 |
| 0.9791666666666666 | 0 |
| 0.9798611111111111 | 0 |
| 0.9805555555555556 | 0 |
| 0.9812500000000001 | 0 |
| 0.9819444444444444 | 0 |
| 0.9826388888888888 | 0 |
| 0.9833333333333334 | 0 |
| 0.9840277777777778 | 0 |
| 0.9847222222222222 | 0 |
| 0.9854166666666666 | 0 |
| 0.9861111111111112 | 0 |
| 0.9868055555555556 | 0 |
| 0.9874999999999999 | 0 |
| 0.9881944444444444 | 0 |
| 0.9888888888888889 | 0 |
| 0.9895833333333334 | 0 |
| 0.9902777777777777 | 0 |
| 0.9909722222222223 | 0 |
| 0.9916666666666667 | 0 |
| 0.9923611111111111 | 0 |
| 0.9930555555555555 | 0 |
| 0.99375 | 0 |
| 0.9944444444444445 | 0 |
| 0.9951388888888889 | 0 |
| 0.9958333333333332 | 0 |
| 0.9965277777777778 | 0 |
| 0.9972222222222222 | 0 |
| 0.9979166666666667 | 0 |
| 0.998611111111111 | 0 |
| 0.9993055555555556 | 0 |